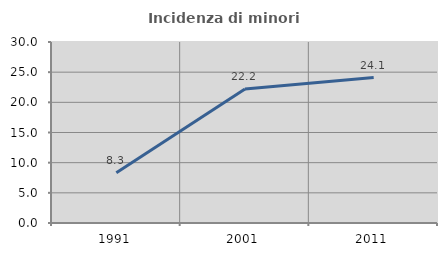
| Category | Incidenza di minori stranieri |
|---|---|
| 1991.0 | 8.333 |
| 2001.0 | 22.222 |
| 2011.0 | 24.096 |